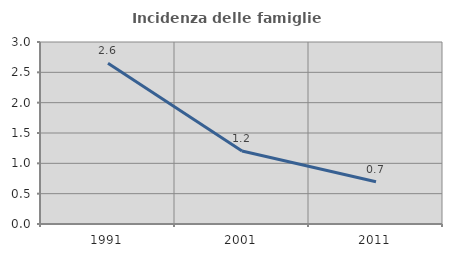
| Category | Incidenza delle famiglie numerose |
|---|---|
| 1991.0 | 2.648 |
| 2001.0 | 1.204 |
| 2011.0 | 0.697 |